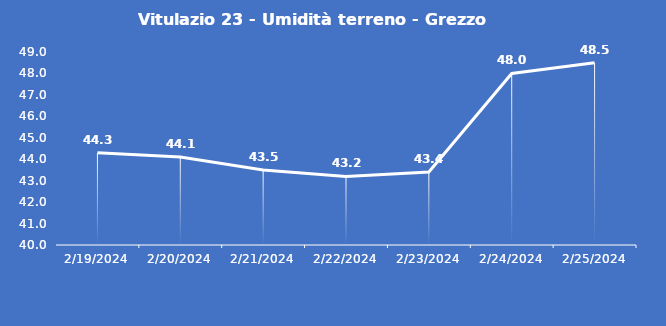
| Category | Vitulazio 23 - Umidità terreno - Grezzo (%VWC) |
|---|---|
| 2/19/24 | 44.3 |
| 2/20/24 | 44.1 |
| 2/21/24 | 43.5 |
| 2/22/24 | 43.2 |
| 2/23/24 | 43.4 |
| 2/24/24 | 48 |
| 2/25/24 | 48.5 |